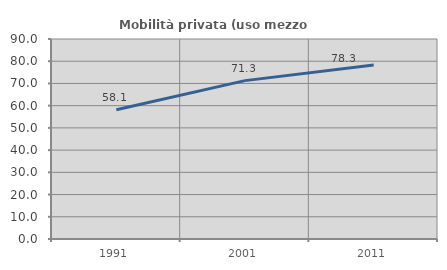
| Category | Mobilità privata (uso mezzo privato) |
|---|---|
| 1991.0 | 58.128 |
| 2001.0 | 71.268 |
| 2011.0 | 78.267 |